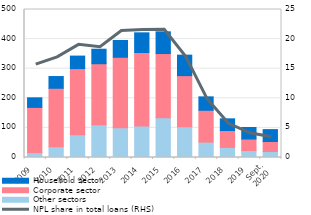
| Category | Other sectors | Corporate sector | Household sector |
|---|---|---|---|
| 2009 | 16.3 | 153.043 | 32.3 |
| 2010 | 36.3 | 197.6 | 39.6 |
| 2011 | 77.1 | 223.3 | 42.2 |
| 2012 | 110.5 | 206.3 | 49 |
| 2013 | 100.2 | 238.4 | 56.7 |
| 2014 | 106.4 | 248.4 | 66.4 |
| 2015 | 134.4 | 216.8 | 73.4 |
| 2016 | 103.8 | 172.8 | 69.2 |
| 2017 | 51.9 | 107.6 | 45.4 |
| 2018 | 34.192 | 56.849 | 39.608 |
| 2019 | 23.45 | 38.949 | 39.017 |
| Sept.
2020 | 20.168 | 33.947 | 40.133 |